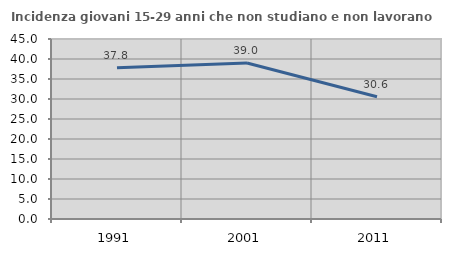
| Category | Incidenza giovani 15-29 anni che non studiano e non lavorano  |
|---|---|
| 1991.0 | 37.801 |
| 2001.0 | 39.013 |
| 2011.0 | 30.551 |